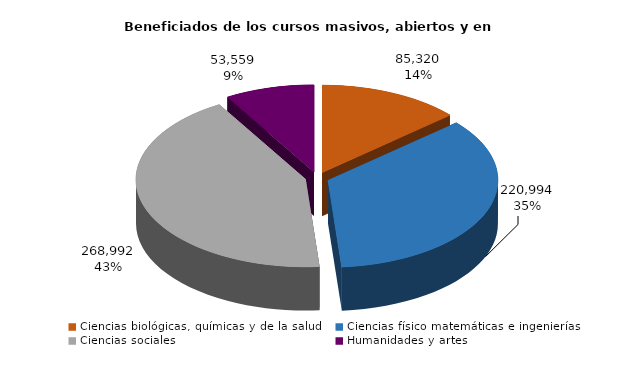
| Category | Series 0 |
|---|---|
| Ciencias biológicas, químicas y de la salud | 85320 |
| Ciencias físico matemáticas e ingenierías | 220994 |
| Ciencias sociales | 268992 |
| Humanidades y artes | 53559 |